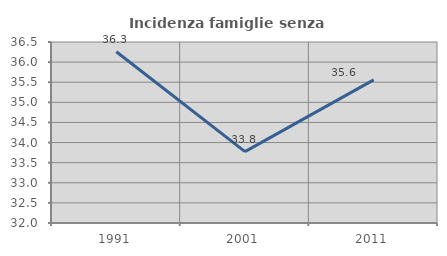
| Category | Incidenza famiglie senza nuclei |
|---|---|
| 1991.0 | 36.257 |
| 2001.0 | 33.776 |
| 2011.0 | 35.559 |